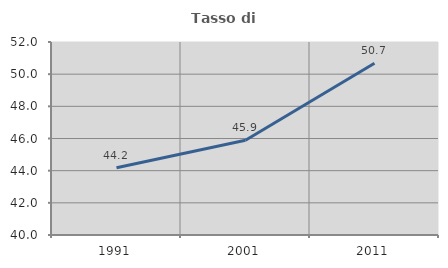
| Category | Tasso di occupazione   |
|---|---|
| 1991.0 | 44.179 |
| 2001.0 | 45.89 |
| 2011.0 | 50.678 |